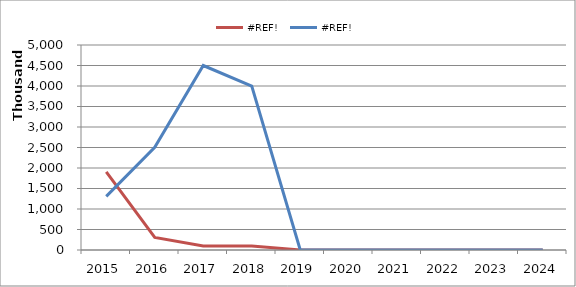
| Category | #REF! |
|---|---|
| 2015.0 | 1307975 |
| 2016.0 | 2506683 |
| 2017.0 | 4500000 |
| 2018.0 | 4000000 |
| 2019.0 | 0 |
| 2020.0 | 0 |
| 2021.0 | 0 |
| 2022.0 | 0 |
| 2023.0 | 0 |
| 2024.0 | 0 |